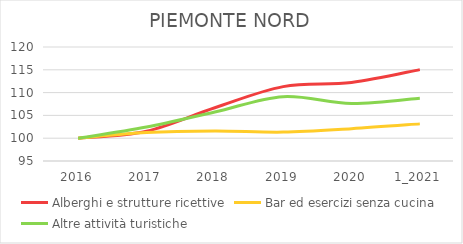
| Category | Alberghi e strutture ricettive | Bar ed esercizi senza cucina | Altre attività turistiche |
|---|---|---|---|
| 2016 | 100 | 100 | 100 |
| 2017 | 101.542 | 101.24 | 102.444 |
| 2018 | 106.684 | 101.579 | 105.746 |
| 2019 | 111.311 | 101.337 | 109.115 |
| 2020 | 112.211 | 102.094 | 107.596 |
| 1_2021 | 115.039 | 103.141 | 108.785 |